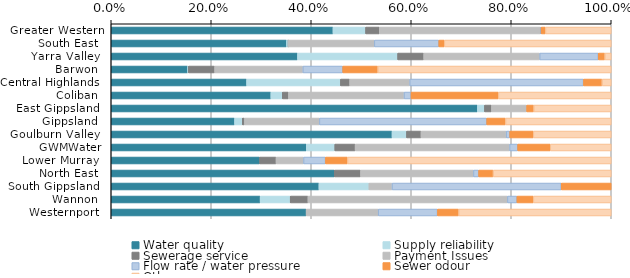
| Category | Water quality | Supply reliability | Sewerage service | Payment Issues | Flow rate / water pressure | Sewer odour | Other |
|---|---|---|---|---|---|---|---|
| Greater Western | 0.444 | 0.065 | 0.028 | 0.322 | 0.002 | 0.009 | 0.132 |
| South East  | 0.351 | 0.003 | 0 | 0.172 | 0.129 | 0.011 | 0.334 |
| Yarra Valley  | 0.373 | 0.2 | 0.052 | 0.232 | 0.117 | 0.013 | 0.013 |
| Barwon  | 0.153 | 0.002 | 0.052 | 0.176 | 0.08 | 0.07 | 0.467 |
| Central Highlands  | 0.271 | 0.188 | 0.018 | 0.12 | 0.348 | 0.037 | 0.018 |
| Coliban  | 0.319 | 0.023 | 0.012 | 0.231 | 0.014 | 0.175 | 0.226 |
| East Gippsland  | 0.732 | 0.014 | 0.014 | 0.07 | 0 | 0.014 | 0.155 |
| Gippsland  | 0.247 | 0.015 | 0.004 | 0.15 | 0.335 | 0.037 | 0.211 |
| Goulburn Valley  | 0.562 | 0.029 | 0.029 | 0.17 | 0.007 | 0.047 | 0.156 |
| GWMWater | 0.39 | 0.057 | 0.041 | 0.309 | 0.016 | 0.065 | 0.122 |
| Lower Murray  | 0.297 | 0 | 0.033 | 0.055 | 0.044 | 0.044 | 0.527 |
| North East  | 0.446 | 0 | 0.052 | 0.226 | 0.01 | 0.029 | 0.236 |
| South Gippsland  | 0.415 | 0.1 | 0 | 0.046 | 0.338 | 0.1 | 0 |
| Wannon  | 0.298 | 0.06 | 0.036 | 0.399 | 0.019 | 0.033 | 0.156 |
| Westernport  | 0.39 | 0 | 0 | 0.144 | 0.119 | 0.042 | 0.305 |